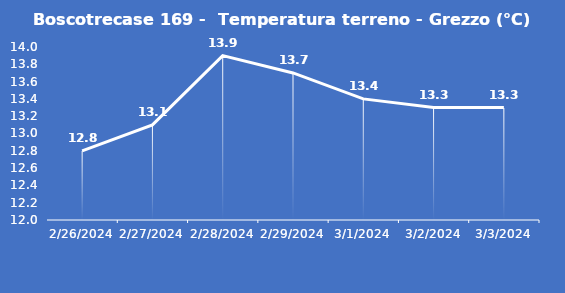
| Category | Boscotrecase 169 -  Temperatura terreno - Grezzo (°C) |
|---|---|
| 2/26/24 | 12.8 |
| 2/27/24 | 13.1 |
| 2/28/24 | 13.9 |
| 2/29/24 | 13.7 |
| 3/1/24 | 13.4 |
| 3/2/24 | 13.3 |
| 3/3/24 | 13.3 |